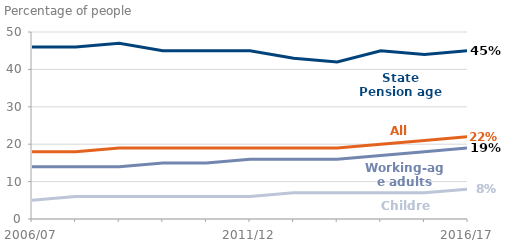
| Category | Working-age adults | State Pension age adults1 | Children | All people |
|---|---|---|---|---|
| 2006/07 | 14 | 46 | 5 | 18 |
| 2007/08 | 14 | 46 | 6 | 18 |
| 2008/09 | 14 | 47 | 6 | 19 |
| 2009/10 | 15 | 45 | 6 | 19 |
| 2010/11 | 15 | 45 | 6 | 19 |
| 2011/12 | 16 | 45 | 6 | 19 |
| 2012/13 | 16 | 43 | 7 | 19 |
| 2013/14 | 16 | 42 | 7 | 19 |
| 2014/15 | 17 | 45 | 7 | 20 |
| 2015/16 | 18 | 44 | 7 | 21 |
| 2016/17 | 19 | 45 | 8 | 22 |